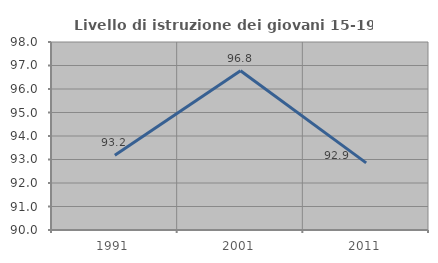
| Category | Livello di istruzione dei giovani 15-19 anni |
|---|---|
| 1991.0 | 93.182 |
| 2001.0 | 96.774 |
| 2011.0 | 92.857 |